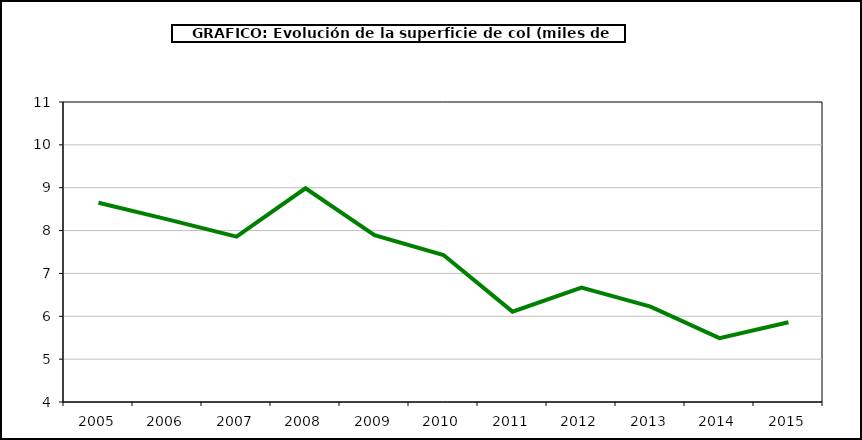
| Category | superficie |
|---|---|
| 2005.0 | 8.648 |
| 2006.0 | 8.261 |
| 2007.0 | 7.857 |
| 2008.0 | 8.987 |
| 2009.0 | 7.895 |
| 2010.0 | 7.43 |
| 2011.0 | 6.108 |
| 2012.0 | 6.669 |
| 2013.0 | 6.224 |
| 2014.0 | 5.489 |
| 2015.0 | 5.861 |